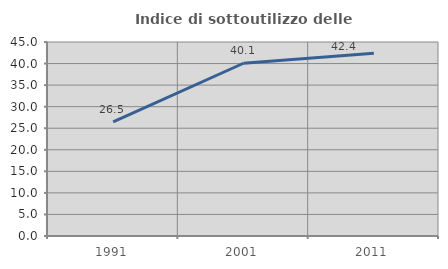
| Category | Indice di sottoutilizzo delle abitazioni  |
|---|---|
| 1991.0 | 26.482 |
| 2001.0 | 40.072 |
| 2011.0 | 42.403 |